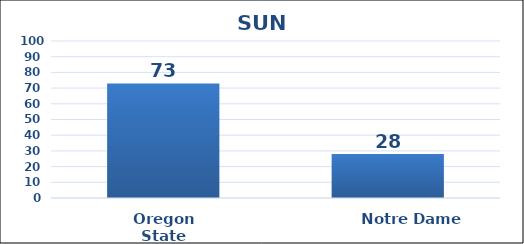
| Category | Series 0 |
|---|---|
| Oregon State | 73 |
| Notre Dame | 28 |